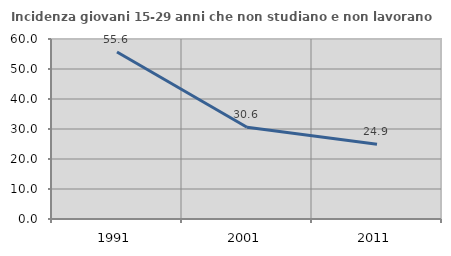
| Category | Incidenza giovani 15-29 anni che non studiano e non lavorano  |
|---|---|
| 1991.0 | 55.647 |
| 2001.0 | 30.585 |
| 2011.0 | 24.911 |